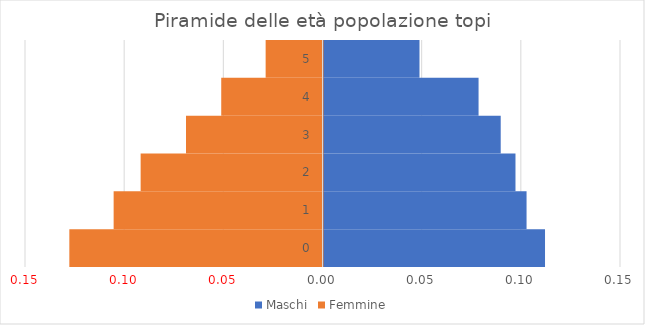
| Category | Maschi | Femmine |
|---|---|---|
| 0.0 | 0.112 | -0.128 |
| 1.0 | 0.102 | -0.105 |
| 2.0 | 0.097 | -0.092 |
| 3.0 | 0.089 | -0.069 |
| 4.0 | 0.078 | -0.051 |
| 5.0 | 0.048 | -0.029 |